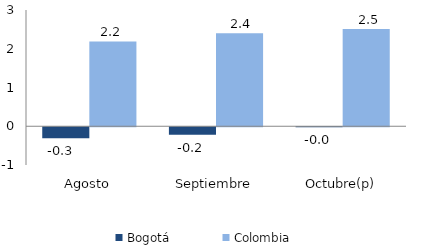
| Category | Bogotá | Colombia |
|---|---|---|
| Agosto | -0.284 | 2.189 |
| Septiembre | -0.193 | 2.402 |
| Octubre(p) | -0.003 | 2.508 |